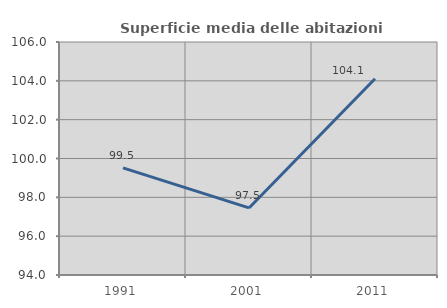
| Category | Superficie media delle abitazioni occupate |
|---|---|
| 1991.0 | 99.52 |
| 2001.0 | 97.454 |
| 2011.0 | 104.104 |